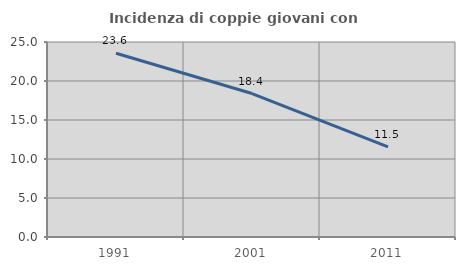
| Category | Incidenza di coppie giovani con figli |
|---|---|
| 1991.0 | 23.554 |
| 2001.0 | 18.392 |
| 2011.0 | 11.547 |